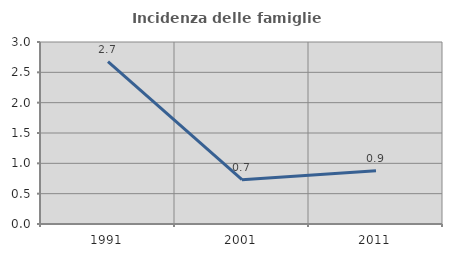
| Category | Incidenza delle famiglie numerose |
|---|---|
| 1991.0 | 2.676 |
| 2001.0 | 0.73 |
| 2011.0 | 0.879 |